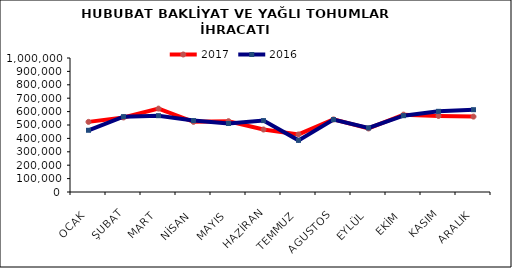
| Category | 2017 | 2016 |
|---|---|---|
| OCAK | 523301.514 | 460593.682 |
| ŞUBAT | 556350.541 | 562234.93 |
| MART | 622260.372 | 569482.752 |
| NİSAN | 523476.745 | 532964.351 |
| MAYIS | 528449.204 | 511350.866 |
| HAZİRAN | 466287.968 | 532804.505 |
| TEMMUZ | 429494.06 | 385329.331 |
| AGUSTOS | 541693.874 | 540411.596 |
| EYLÜL | 474104.718 | 477793.759 |
| EKİM | 577278.031 | 569520.305 |
| KASIM | 567167.281 | 602068.51 |
| ARALIK | 562647.663 | 614283.329 |